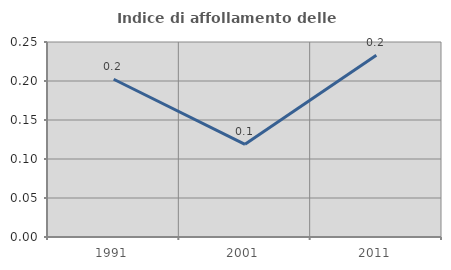
| Category | Indice di affollamento delle abitazioni  |
|---|---|
| 1991.0 | 0.202 |
| 2001.0 | 0.119 |
| 2011.0 | 0.233 |